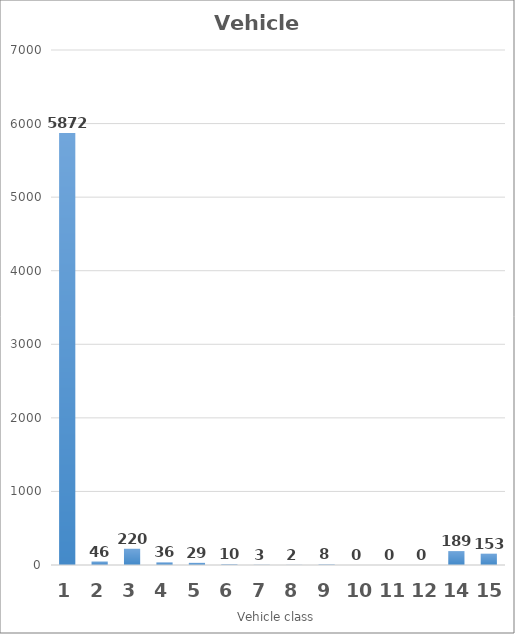
| Category | Series 0 |
|---|---|
| 1.0 | 5872 |
| 2.0 | 46 |
| 3.0 | 220 |
| 4.0 | 36 |
| 5.0 | 29 |
| 6.0 | 10 |
| 7.0 | 3 |
| 8.0 | 2 |
| 9.0 | 8 |
| 10.0 | 0 |
| 11.0 | 0 |
| 12.0 | 0 |
| 14.0 | 189 |
| 15.0 | 153 |